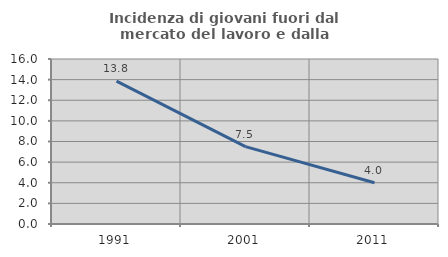
| Category | Incidenza di giovani fuori dal mercato del lavoro e dalla formazione  |
|---|---|
| 1991.0 | 13.846 |
| 2001.0 | 7.5 |
| 2011.0 | 4 |